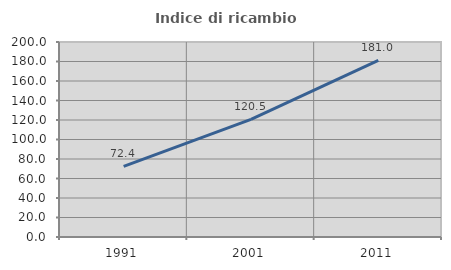
| Category | Indice di ricambio occupazionale  |
|---|---|
| 1991.0 | 72.414 |
| 2001.0 | 120.548 |
| 2011.0 | 181.046 |